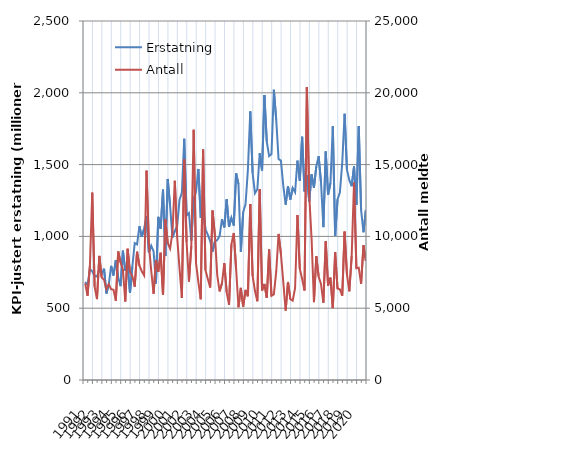
| Category | Erstatning |
|---|---|
| 1991.0 | 682.861 |
| nan | 660.593 |
| nan | 770.781 |
| nan | 757.68 |
| 1992.0 | 724.967 |
| nan | 720.337 |
| nan | 769.124 |
| nan | 738.283 |
| 1993.0 | 775.228 |
| nan | 602.058 |
| nan | 664.256 |
| nan | 794.965 |
| 1994.0 | 727.895 |
| nan | 835.014 |
| nan | 715.669 |
| nan | 653.422 |
| 1995.0 | 900.586 |
| nan | 761.203 |
| nan | 803.181 |
| nan | 605.711 |
| 1996.0 | 789.173 |
| nan | 953.39 |
| nan | 943.881 |
| nan | 1071.001 |
| 1997.0 | 996.152 |
| nan | 1053.434 |
| nan | 1142.066 |
| nan | 887.884 |
| 1998.0 | 935.373 |
| nan | 896.35 |
| nan | 671.783 |
| nan | 1136.193 |
| 1999.0 | 1052.729 |
| nan | 1325.657 |
| nan | 863.644 |
| nan | 1400.154 |
| 2000.0 | 1214.232 |
| nan | 993.707 |
| nan | 1038.895 |
| nan | 1072.169 |
| 2001.0 | 1253.265 |
| nan | 1304.559 |
| nan | 1679.765 |
| nan | 1144.776 |
| 2002.0 | 1162.727 |
| nan | 970.425 |
| nan | 1266.256 |
| nan | 1309.736 |
| 2003.0 | 1469.594 |
| nan | 1128.08 |
| nan | 1190.808 |
| nan | 1048.721 |
| 2004.0 | 1011.439 |
| nan | 967.557 |
| nan | 894.762 |
| nan | 963.959 |
| 2005.0 | 974.405 |
| nan | 1002.461 |
| nan | 1119.883 |
| nan | 1062.719 |
| 2006.0 | 1258.391 |
| nan | 1065.827 |
| nan | 1130.31 |
| nan | 1075.24 |
| 2007.0 | 1439.915 |
| nan | 1364.05 |
| nan | 893.677 |
| nan | 1169.116 |
| 2008.0 | 1224.519 |
| nan | 1465.019 |
| nan | 1870.593 |
| nan | 1441 |
| 2009.0 | 1301.099 |
| nan | 1328.36 |
| nan | 1578.846 |
| nan | 1458.773 |
| 2010.0 | 1984.188 |
| nan | 1660.479 |
| nan | 1559.014 |
| nan | 1574.052 |
| 2011.0 | 2021.055 |
| nan | 1813.246 |
| nan | 1538.78 |
| nan | 1527.545 |
| 2012.0 | 1353.017 |
| nan | 1220.672 |
| nan | 1348.959 |
| nan | 1256.877 |
| 2013.0 | 1337.311 |
| nan | 1307.667 |
| nan | 1527.592 |
| nan | 1388.401 |
| 2014.0 | 1693.847 |
| nan | 1313.108 |
| nan | 1424.554 |
| nan | 1243.361 |
| 2015.0 | 1432.487 |
| nan | 1339.063 |
| nan | 1487.095 |
| nan | 1558.19 |
| 2016.0 | 1375.58 |
| nan | 1064.405 |
| nan | 1591.137 |
| nan | 1290.489 |
| 2017.0 | 1371.785 |
| nan | 1767.479 |
| nan | 1003.271 |
| nan | 1257.841 |
| 2018.0 | 1305.9 |
| nan | 1512.06 |
| nan | 1853.654 |
| nan | 1464.441 |
| 2019.0 | 1391.758 |
| nan | 1349.421 |
| nan | 1486.971 |
| nan | 1218.36 |
| 2020.0 | 1766.411 |
| nan | 1183.175 |
| nan | 1028.942 |
| nan | 1182.948 |